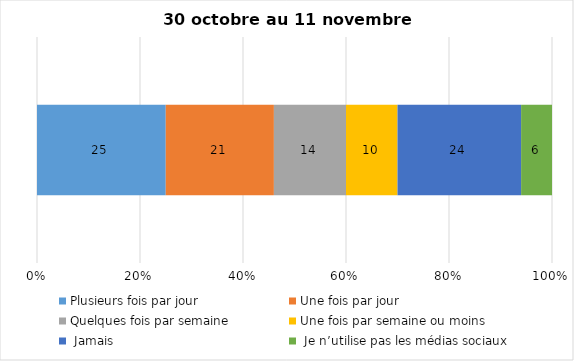
| Category | Plusieurs fois par jour | Une fois par jour | Quelques fois par semaine   | Une fois par semaine ou moins   |  Jamais   |  Je n’utilise pas les médias sociaux |
|---|---|---|---|---|---|---|
| 0 | 25 | 21 | 14 | 10 | 24 | 6 |